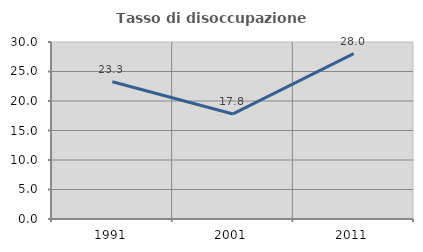
| Category | Tasso di disoccupazione giovanile  |
|---|---|
| 1991.0 | 23.26 |
| 2001.0 | 17.804 |
| 2011.0 | 28.044 |